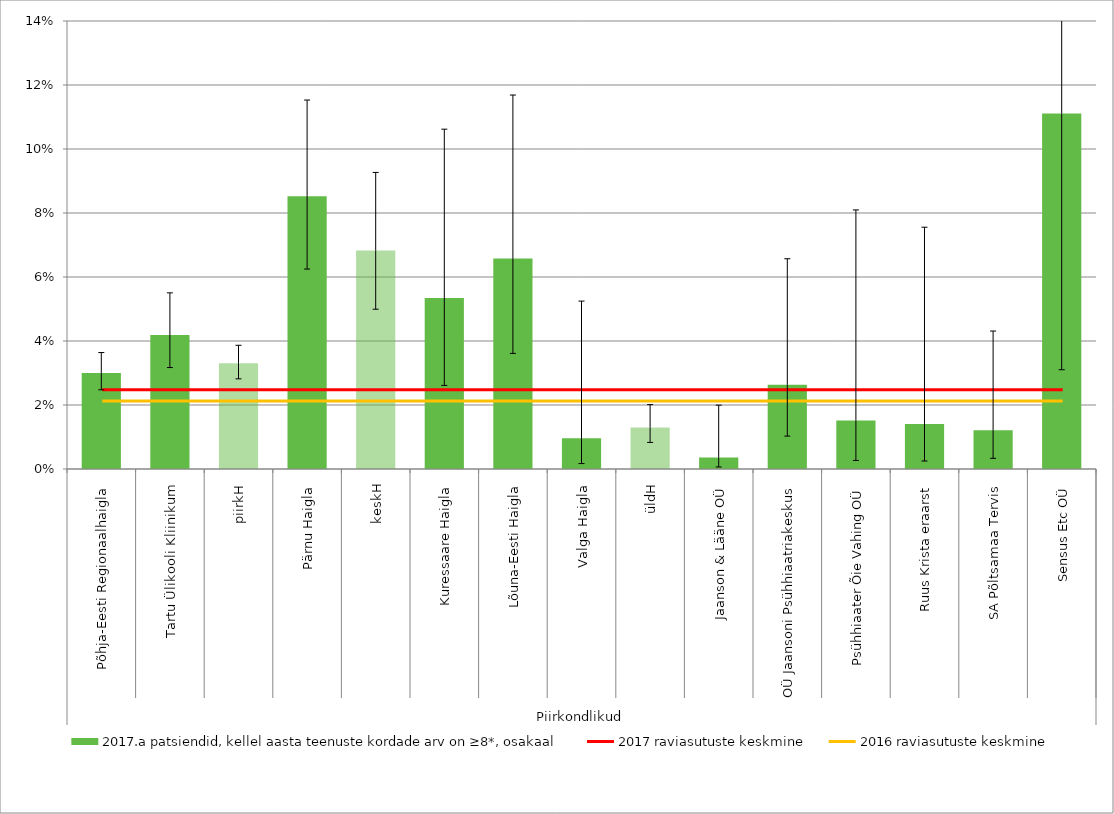
| Category | 2017.a patsiendid, kellel aasta teenuste kordade arv on ≥8*, osakaal |
|---|---|
| 0 | 0.03 |
| 1 | 0.042 |
| 2 | 0.033 |
| 3 | 0.085 |
| 4 | 0.068 |
| 5 | 0.053 |
| 6 | 0.066 |
| 7 | 0.01 |
| 8 | 0.013 |
| 9 | 0.004 |
| 10 | 0.026 |
| 11 | 0.015 |
| 12 | 0.014 |
| 13 | 0.012 |
| 14 | 0.111 |